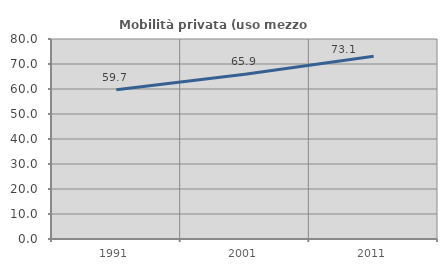
| Category | Mobilità privata (uso mezzo privato) |
|---|---|
| 1991.0 | 59.677 |
| 2001.0 | 65.899 |
| 2011.0 | 73.113 |